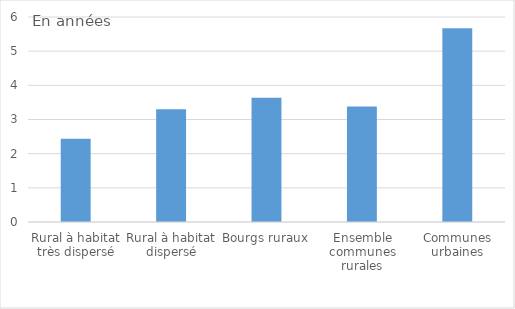
| Category | Délai de désendettement |
|---|---|
| Rural à habitat très dispersé | 2.434 |
| Rural à habitat dispersé | 3.301 |
| Bourgs ruraux | 3.634 |
| Ensemble communes rurales | 3.378 |
| Communes urbaines | 5.67 |